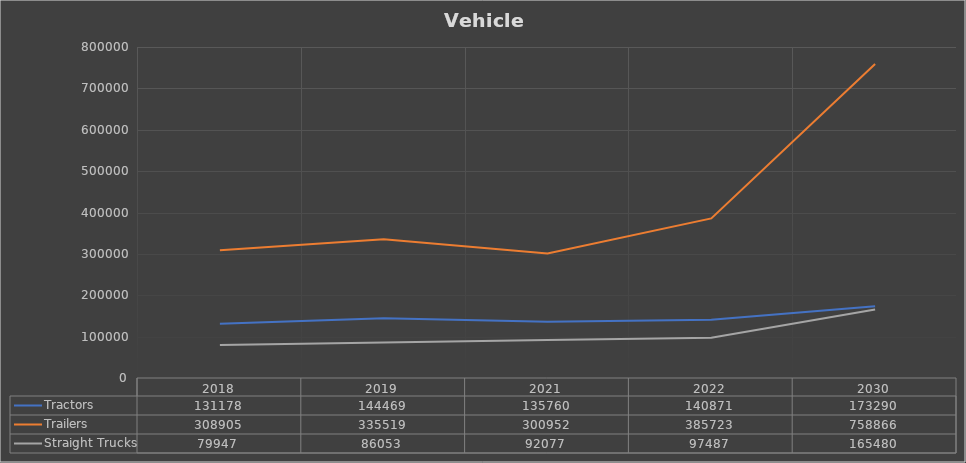
| Category | Tractors | Trailers | Straight Trucks |
|---|---|---|---|
| 2018.0 | 131178 | 308905 | 79947 |
| 2019.0 | 144469 | 335519 | 86053 |
| 2021.0 | 135760 | 300952 | 92077 |
| 2022.0 | 140871 | 385723 | 97487 |
| 2030.0 | 173289.966 | 758866.185 | 165480.319 |